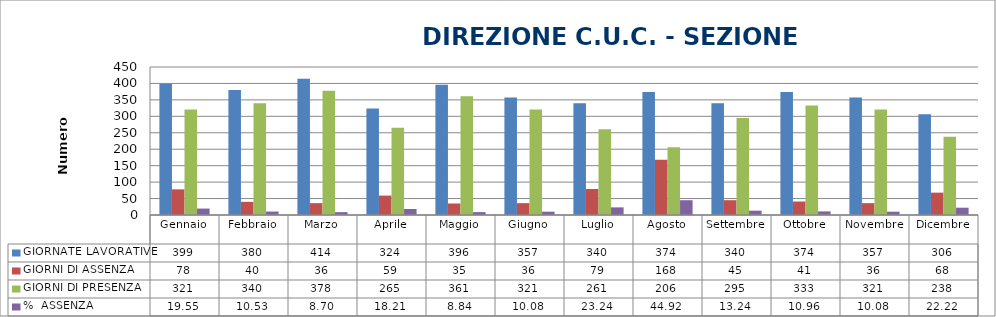
| Category | GIORNATE LAVORATIVE | GIORNI DI ASSENZA | GIORNI DI PRESENZA | %  ASSENZA |
|---|---|---|---|---|
| Gennaio | 399 | 78 | 321 | 19.549 |
| Febbraio | 380 | 40 | 340 | 10.526 |
| Marzo | 414 | 36 | 378 | 8.696 |
| Aprile | 324 | 59 | 265 | 18.21 |
| Maggio | 396 | 35 | 361 | 8.838 |
| Giugno | 357 | 36 | 321 | 10.084 |
| Luglio | 340 | 79 | 261 | 23.235 |
| Agosto | 374 | 168 | 206 | 44.92 |
| Settembre | 340 | 45 | 295 | 13.235 |
| Ottobre | 374 | 41 | 333 | 10.963 |
| Novembre | 357 | 36 | 321 | 10.084 |
| Dicembre | 306 | 68 | 238 | 22.222 |